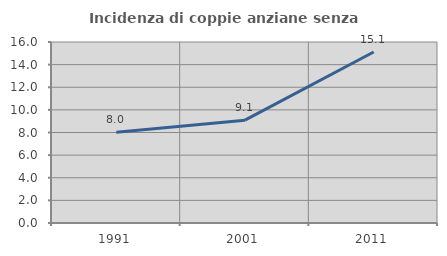
| Category | Incidenza di coppie anziane senza figli  |
|---|---|
| 1991.0 | 8.014 |
| 2001.0 | 9.091 |
| 2011.0 | 15.12 |